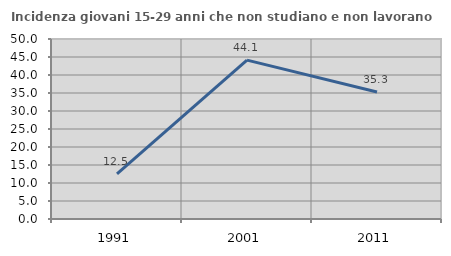
| Category | Incidenza giovani 15-29 anni che non studiano e non lavorano  |
|---|---|
| 1991.0 | 12.514 |
| 2001.0 | 44.138 |
| 2011.0 | 35.294 |